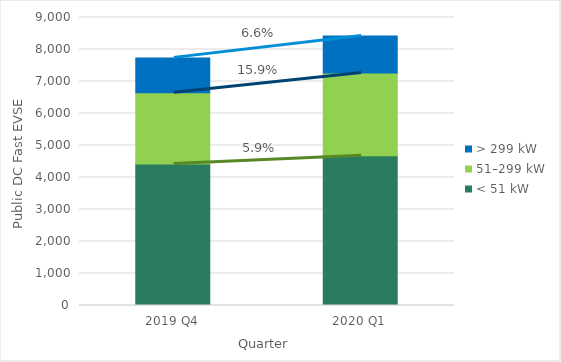
| Category | < 51 kW | 51–299 kW | > 299 kW |
|---|---|---|---|
| 2019 Q4 | 4420 | 2228 | 1090 |
| 2020 Q1 | 4681 | 2582 | 1162 |